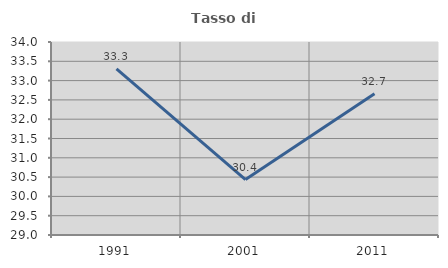
| Category | Tasso di occupazione   |
|---|---|
| 1991.0 | 33.301 |
| 2001.0 | 30.435 |
| 2011.0 | 32.662 |